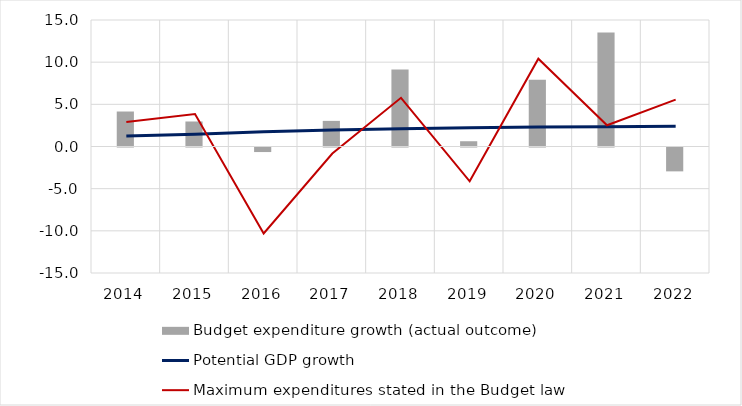
| Category | Budget expenditure growth (actual outcome) |
|---|---|
| 2014.0 | 4.149 |
| 2015.0 | 2.965 |
| 2016.0 | -0.54 |
| 2017.0 | 3.039 |
| 2018.0 | 9.134 |
| 2019.0 | 0.624 |
| 2020.0 | 7.924 |
| 2021.0 | 13.506 |
| 2022.0 | -2.83 |